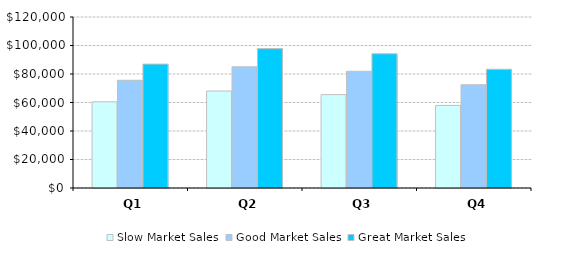
| Category | Slow Market Sales | Good Market Sales | Great Market Sales |
|---|---|---|---|
| Q1 | 60480 | 75600 | 86940 |
| Q2 | 68040 | 85050 | 97807.5 |
| Q3 | 65520 | 81900 | 94185 |
| Q4 | 57960 | 72450 | 83317.5 |